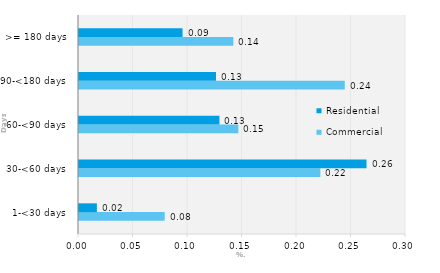
| Category | Commercial | Residential |
|---|---|---|
| 1-<30 days | 0.079 | 0.016 |
| 30-<60 days | 0.221 | 0.264 |
| 60-<90 days | 0.146 | 0.129 |
| 90-<180 days | 0.244 | 0.126 |
| >= 180 days | 0.142 | 0.095 |